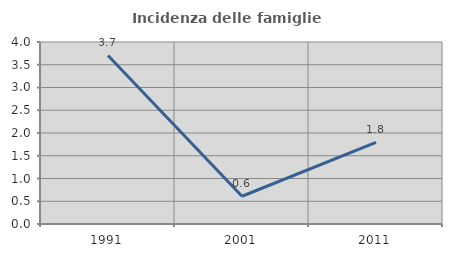
| Category | Incidenza delle famiglie numerose |
|---|---|
| 1991.0 | 3.704 |
| 2001.0 | 0.61 |
| 2011.0 | 1.794 |